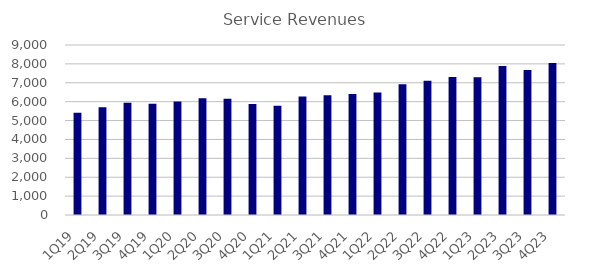
| Category | Service Revenues |
|---|---|
| 1Q19 | 5416.491 |
| 2Q19 | 5702.205 |
| 3Q19 | 5938.03 |
| 4Q19 | 5893.931 |
| 1Q20 | 6007.194 |
| 2Q20 | 6179.221 |
| 3Q20 | 6149.041 |
| 4Q20 | 5877.299 |
| 1Q21 | 5787.55 |
| 2Q21 | 6279.573 |
| 3Q21 | 6339.808 |
| 4Q21 | 6399.603 |
| 1Q22 | 6481.942 |
| 2Q22 | 6915.735 |
| 3Q22 | 7106.449 |
| 4Q22 | 7303.931 |
| 1Q23 | 7295.369 |
| 2Q23 | 7885.442 |
| 3Q23 | 7678.33 |
| 4Q23 | 8048.088 |